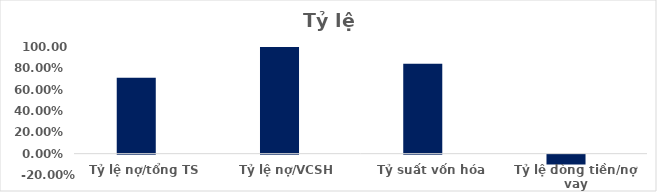
| Category | Series 0 | Series 1 | Series 2 | Series 3 | Series 4 | Series 5 | Series 6 |
|---|---|---|---|---|---|---|---|
| Tỷ lệ nợ/tổng TS | 0.712 |  |  |  |  |  |  |
| Tỷ lệ nợ/VCSH | 2.474 |  |  |  |  |  |  |
| Tỷ suất vốn hóa | 0.842 |  |  |  |  |  |  |
| Tỷ lệ dòng tiền/nợ vay | -0.093 |  |  |  |  |  |  |